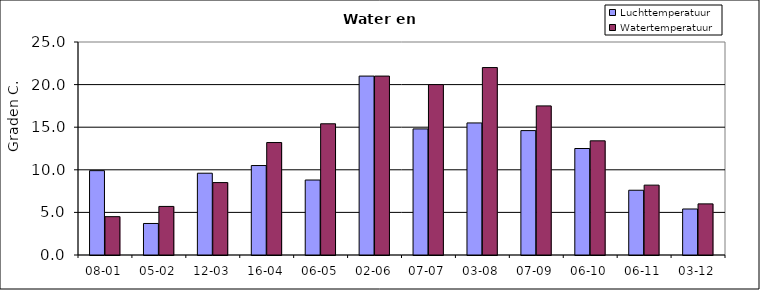
| Category | Luchttemperatuur | Watertemperatuur |
|---|---|---|
| 08-01 | 9.9 | 4.5 |
| 05-02 | 3.7 | 5.7 |
| 12-03 | 9.6 | 8.5 |
| 16-04 | 10.5 | 13.2 |
| 06-05 | 8.8 | 15.4 |
| 02-06 | 21 | 21 |
| 07-07 | 14.8 | 20 |
| 03-08 | 15.5 | 22 |
| 07-09 | 14.6 | 17.5 |
| 06-10 | 12.5 | 13.4 |
| 06-11 | 7.6 | 8.2 |
| 03-12 | 5.4 | 6 |